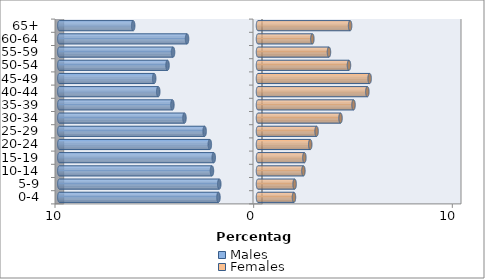
| Category | Males | Females |
|---|---|---|
| 0-4 | -1.99 | 1.81 |
| 5-9 | -1.95 | 1.843 |
| 10-14 | -2.318 | 2.285 |
| 15-19 | -2.228 | 2.335 |
| 20-24 | -2.425 | 2.629 |
| 25-29 | -2.687 | 2.949 |
| 30-34 | -3.702 | 4.153 |
| 35-39 | -4.309 | 4.808 |
| 40-44 | -5.021 | 5.505 |
| 45-49 | -5.226 | 5.619 |
| 50-54 | -4.554 | 4.579 |
| 55-59 | -4.276 | 3.571 |
| 60-64 | -3.571 | 2.736 |
| 65+ | -6.283 | 4.636 |